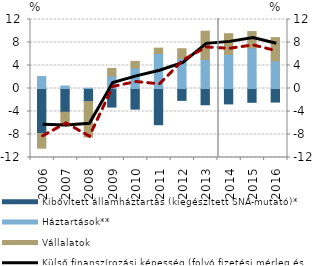
| Category | Kibővített államháztartás (kiegészített SNA-mutató)* | Háztartások** | Vállalatok |
|---|---|---|---|
| 2006.0 | -7.826 | 2.072 | -2.551 |
| 2007.0 | -4.125 | 0.433 | -2.38 |
| 2008.0 | -2.271 | 0.047 | -6.155 |
| 2009.0 | -3.23 | 2.203 | 1.297 |
| 2010.0 | -3.588 | 3.582 | 1.136 |
| 2011.0 | -6.299 | 6.084 | 0.936 |
| 2012.0 | -2.063 | 5.24 | 1.677 |
| 2013.0 | -2.829 | 5.069 | 4.903 |
| 2014.0 | -2.682 | 5.92 | 3.611 |
| 2015.0 | -2.4 | 7.074 | 2.826 |
| 2016.0 | -2.363 | 4.794 | 4.059 |